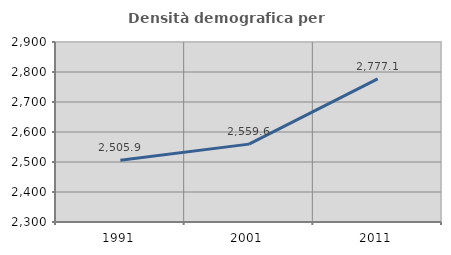
| Category | Densità demografica |
|---|---|
| 1991.0 | 2505.898 |
| 2001.0 | 2559.578 |
| 2011.0 | 2777.069 |